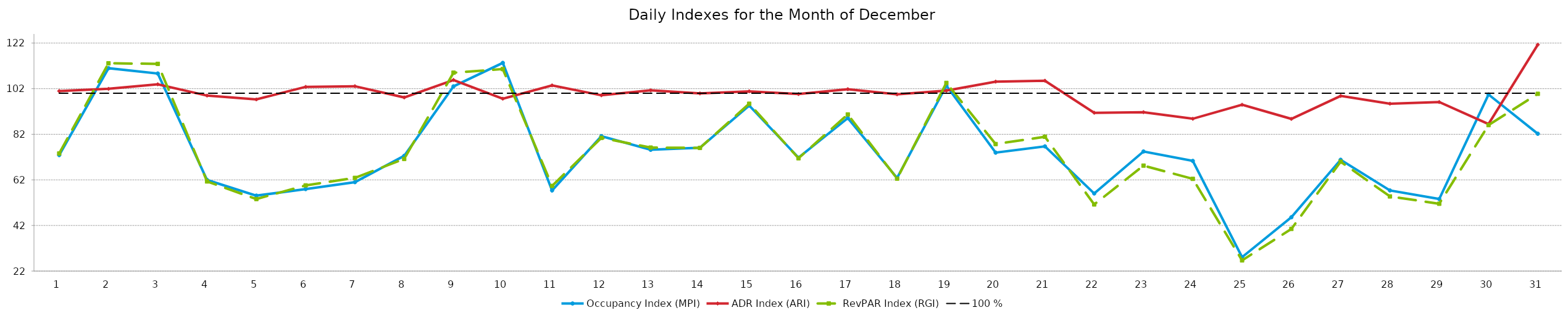
| Category | Occupancy Index (MPI) | ADR Index (ARI) | RevPAR Index (RGI) | 100 % |
|---|---|---|---|---|
| 1.0 | 72.871 | 100.967 | 73.576 | 100 |
| 2.0 | 110.991 | 101.934 | 113.138 | 100 |
| 3.0 | 108.656 | 103.902 | 112.895 | 100 |
| 4.0 | 61.949 | 98.964 | 61.307 | 100 |
| 5.0 | 55.087 | 97.285 | 53.591 | 100 |
| 6.0 | 57.968 | 102.793 | 59.588 | 100 |
| 7.0 | 61.003 | 103.075 | 62.878 | 100 |
| 8.0 | 72.542 | 98.155 | 71.204 | 100 |
| 9.0 | 103.019 | 105.821 | 109.016 | 100 |
| 10.0 | 113.311 | 97.604 | 110.597 | 100 |
| 11.0 | 57.371 | 103.457 | 59.355 | 100 |
| 12.0 | 81.165 | 99.096 | 80.432 | 100 |
| 13.0 | 75.206 | 101.281 | 76.169 | 100 |
| 14.0 | 76.074 | 99.927 | 76.019 | 100 |
| 15.0 | 94.608 | 100.844 | 95.406 | 100 |
| 16.0 | 71.737 | 99.659 | 71.493 | 100 |
| 17.0 | 89.116 | 101.778 | 90.701 | 100 |
| 18.0 | 62.85 | 99.529 | 62.554 | 100 |
| 19.0 | 103.343 | 101.153 | 104.535 | 100 |
| 20.0 | 73.945 | 105.102 | 77.718 | 100 |
| 21.0 | 76.694 | 105.488 | 80.903 | 100 |
| 22.0 | 56.037 | 91.428 | 51.233 | 100 |
| 23.0 | 74.461 | 91.669 | 68.257 | 100 |
| 24.0 | 70.31 | 88.81 | 62.442 | 100 |
| 25.0 | 28.1 | 94.946 | 26.68 | 100 |
| 26.0 | 45.611 | 88.752 | 40.481 | 100 |
| 27.0 | 70.811 | 98.809 | 69.968 | 100 |
| 28.0 | 57.371 | 95.418 | 54.743 | 100 |
| 29.0 | 53.594 | 96.151 | 51.531 | 100 |
| 30.0 | 99.444 | 86.502 | 86.021 | 100 |
| 31.0 | 82.239 | 121.291 | 99.748 | 100 |